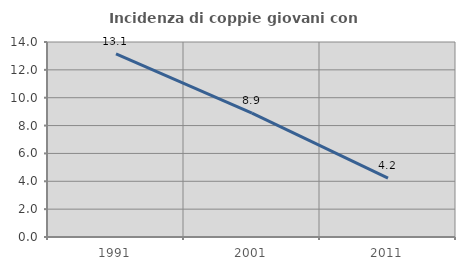
| Category | Incidenza di coppie giovani con figli |
|---|---|
| 1991.0 | 13.139 |
| 2001.0 | 8.889 |
| 2011.0 | 4.225 |